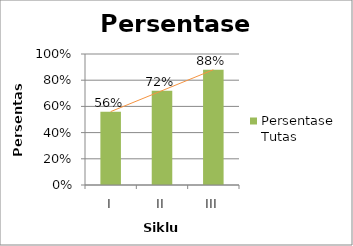
| Category | Persentase Tutas |
|---|---|
| I | 0.56 |
| II | 0.72 |
| III | 0.88 |